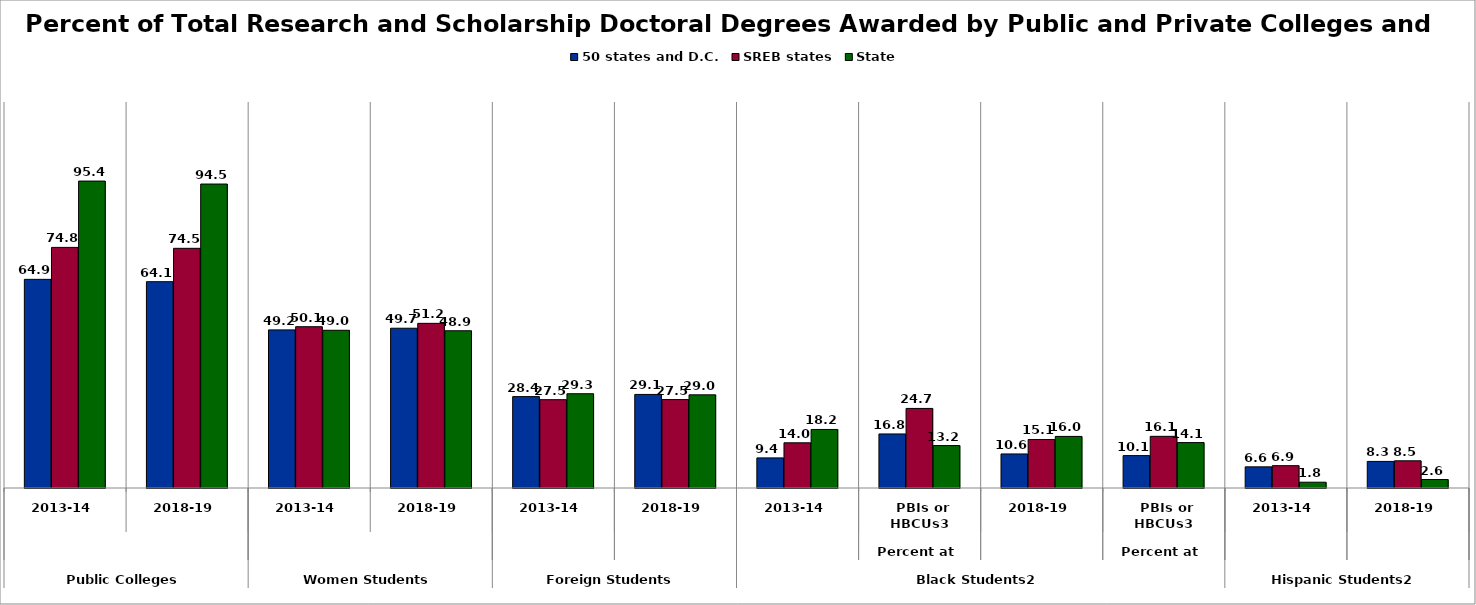
| Category | 50 states and D.C. | SREB states | State |
|---|---|---|---|
| 0 | 64.865 | 74.798 | 95.417 |
| 1 | 64.139 | 74.512 | 94.495 |
| 2 | 49.156 | 50.14 | 49.028 |
| 3 | 49.67 | 51.192 | 48.886 |
| 4 | 28.409 | 27.463 | 29.306 |
| 5 | 29.09 | 27.489 | 28.965 |
| 6 | 9.355 | 14.05 | 18.2 |
| 7 | 16.805 | 24.737 | 13.187 |
| 8 | 10.581 | 15.082 | 16.038 |
| 9 | 10.072 | 16.063 | 14.118 |
| 10 | 6.578 | 6.944 | 1.8 |
| 11 | 8.266 | 8.458 | 2.642 |